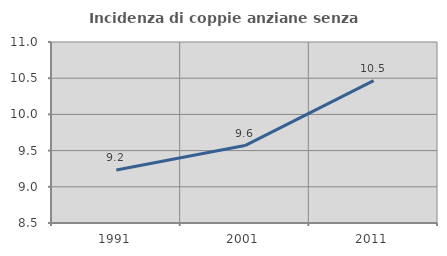
| Category | Incidenza di coppie anziane senza figli  |
|---|---|
| 1991.0 | 9.231 |
| 2001.0 | 9.569 |
| 2011.0 | 10.467 |